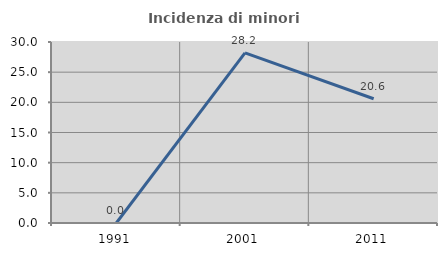
| Category | Incidenza di minori stranieri |
|---|---|
| 1991.0 | 0 |
| 2001.0 | 28.205 |
| 2011.0 | 20.588 |